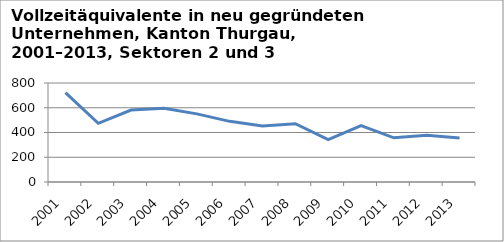
| Category | Sektoren 2 und 3 |
|---|---|
| 2001.0 | 721.8 |
| 2002.0 | 474.5 |
| 2003.0 | 581.1 |
| 2004.0 | 595.7 |
| 2005.0 | 550.5 |
| 2006.0 | 490.2 |
| 2007.0 | 453.2 |
| 2008.0 | 471.2 |
| 2009.0 | 342.8 |
| 2010.0 | 456.5 |
| 2011.0 | 357.3 |
| 2012.0 | 377.7 |
| 2013.0 | 356.3 |